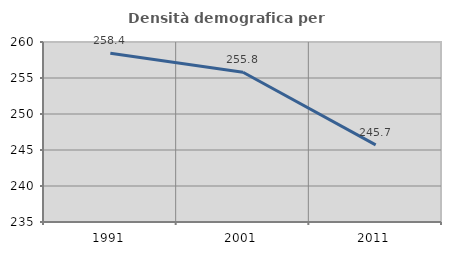
| Category | Densità demografica |
|---|---|
| 1991.0 | 258.448 |
| 2001.0 | 255.804 |
| 2011.0 | 245.705 |